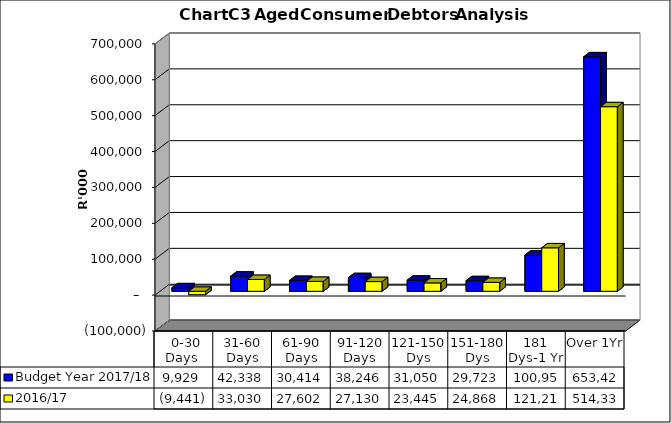
| Category | Budget Year 2017/18 | 2016/17 |
|---|---|---|
|  0-30 Days  | 9929193.4 | -9441294.51 |
| 31-60 Days | 42338265.3 | 33029535.14 |
| 61-90 Days | 30413842.43 | 27601873.33 |
| 91-120 Days | 38245709.19 | 27129652.88 |
| 121-150 Dys | 31049795.06 | 23445321.59 |
| 151-180 Dys | 29723301.49 | 24867989.97 |
| 181 Dys-1 Yr | 100950899.09 | 121211746.52 |
| Over 1Yr | 653420729.6 | 514338863.86 |